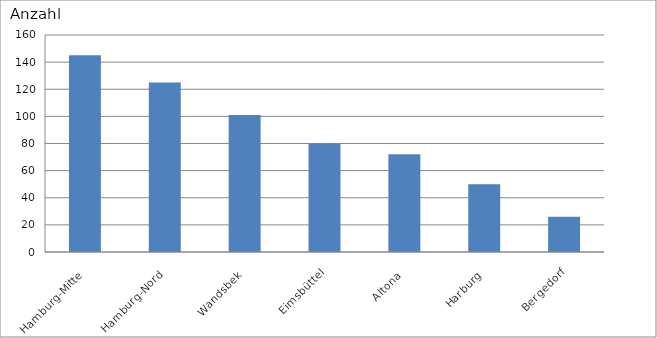
| Category | Hamburg-Mitte Hamburg-Nord Wandsbek Eimsbüttel Altona Harburg Bergedorf |
|---|---|
| Hamburg-Mitte | 145 |
| Hamburg-Nord | 125 |
| Wandsbek | 101 |
| Eimsbüttel | 80 |
| Altona | 72 |
| Harburg | 50 |
| Bergedorf | 26 |